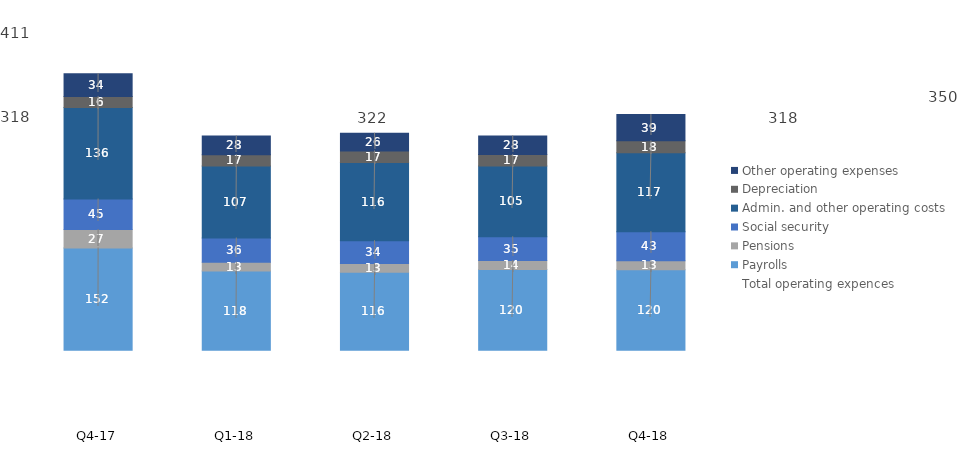
| Category | Payrolls | Pensions | Social security | Admin. and other operating costs | Depreciation | Other operating expenses |
|---|---|---|---|---|---|---|
| Q4-18 | 119.563 | 13.071 | 43.33 | 117.052 | 17.876 | 38.942 |
| Q3-18 | 119.65 | 13.542 | 35.208 | 105.09 | 17.18 | 27.579 |
| Q2-18 | 115.69 | 12.848 | 33.982 | 116.179 | 17.17 | 26.198 |
| Q1-18 | 117.7 | 13 | 35.9 | 107 | 16.7 | 27.8 |
| Q4-17 | 151.8 | 27.4 | 45.2 | 136 | 16.4 | 33.9 |